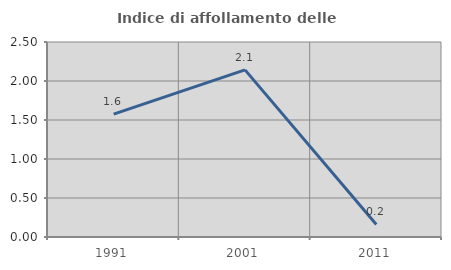
| Category | Indice di affollamento delle abitazioni  |
|---|---|
| 1991.0 | 1.575 |
| 2001.0 | 2.143 |
| 2011.0 | 0.161 |